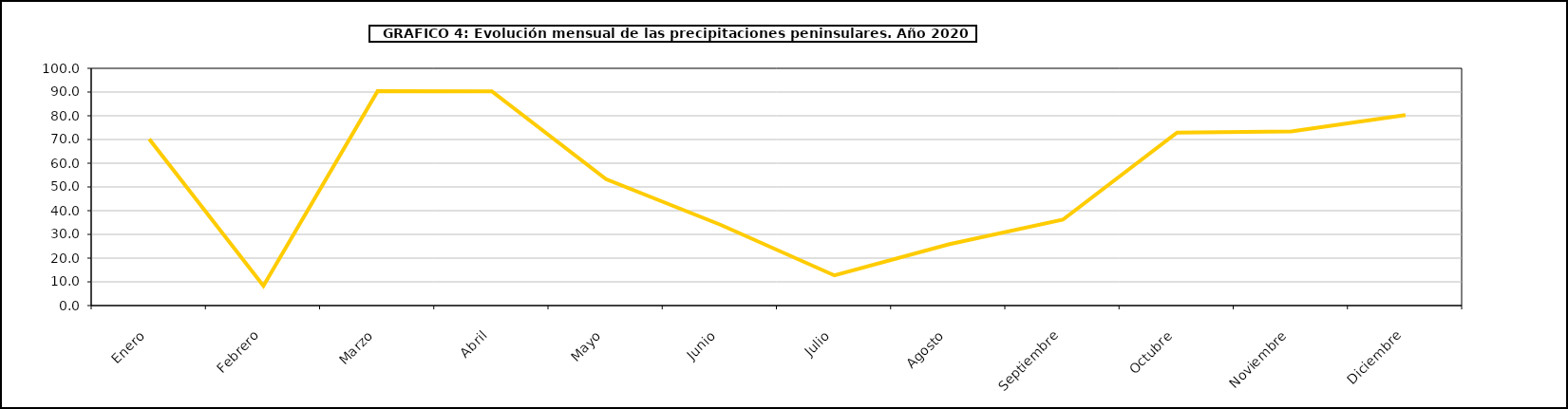
| Category | peninsula |
|---|---|
| 0 | 70.2 |
| 1 | 8.3 |
| 2 | 90.4 |
| 3 | 90.3 |
| 4 | 53.3 |
| 5 | 34.1 |
| 6 | 12.7 |
| 7 | 25.8 |
| 8 | 36.2 |
| 9 | 72.9 |
| 10 | 73.4 |
| 11 | 80.3 |